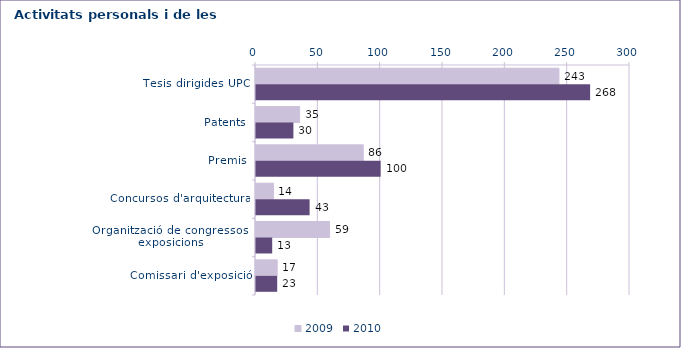
| Category | 2009 | 2010 |
|---|---|---|
| Tesis dirigides UPC | 243 | 268 |
| Patents | 35 | 30 |
| Premis | 86 | 100 |
| Concursos d'arquitectura | 14 | 43 |
| Organització de congressos i exposicions | 59 | 13 |
| Comissari d'exposició | 17 | 17 |